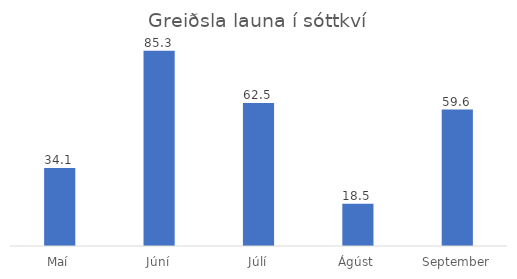
| Category | Series 0 |
|---|---|
| Maí | 34.1 |
| Júní | 85.3 |
| Júlí | 62.5 |
| Ágúst | 18.5 |
| September | 59.6 |